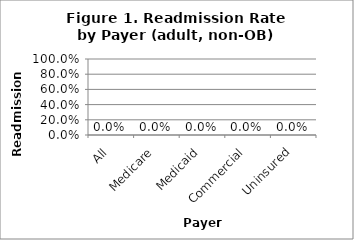
| Category | Series 0 |
|---|---|
| All | 0 |
| Medicare | 0 |
| Medicaid | 0 |
| Commercial | 0 |
| Uninsured | 0 |